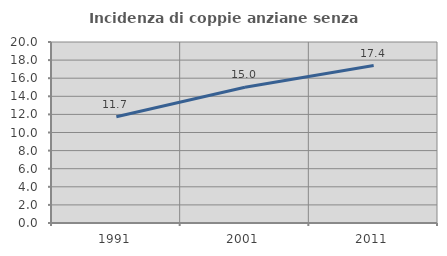
| Category | Incidenza di coppie anziane senza figli  |
|---|---|
| 1991.0 | 11.733 |
| 2001.0 | 15.005 |
| 2011.0 | 17.394 |